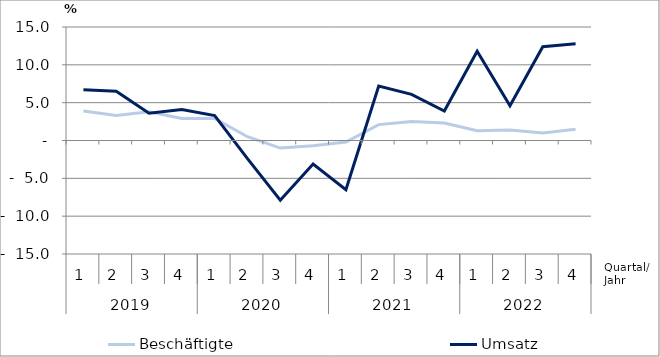
| Category | Beschäftigte | Umsatz |
|---|---|---|
| 0 | 3.9 | 6.7 |
| 1 | 3.3 | 6.5 |
| 2 | 3.8 | 3.6 |
| 3 | 2.9 | 4.1 |
| 4 | 2.9 | 3.3 |
| 5 | 0.5 | -2.4 |
| 6 | -1 | -7.9 |
| 7 | -0.7 | -3.1 |
| 8 | -0.2 | -6.5 |
| 9 | 2.1 | 7.2 |
| 10 | 2.5 | 6.1 |
| 11 | 2.3 | 3.9 |
| 12 | 1.3 | 11.8 |
| 13 | 1.4 | 4.6 |
| 14 | 1 | 12.4 |
| 15 | 1.5 | 12.8 |